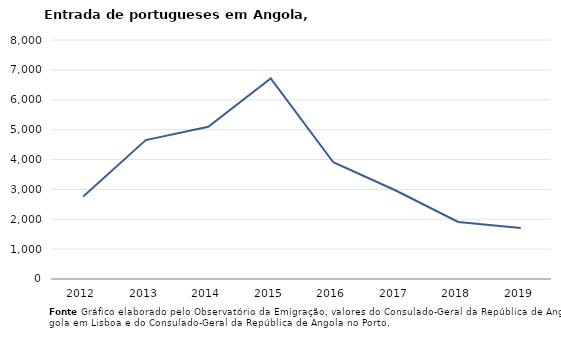
| Category | Entradas |
|---|---|
| 2012.0 | 2761 |
| 2013.0 | 4651 |
| 2014.0 | 5098 |
| 2015.0 | 6715 |
| 2016.0 | 3908 |
| 2017.0 | 2962 |
| 2018.0 | 1910 |
| 2019.0 | 1708 |